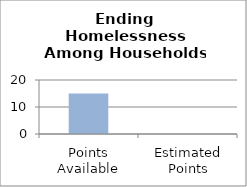
| Category | Ending Homelessness Among Households with Children |
|---|---|
| Points Available | 15 |
| Estimated Points | 0 |